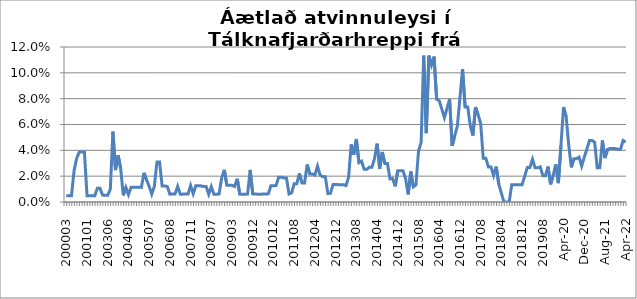
| Category | Series 0 |
|---|---|
| 200003 | 0.005 |
| 200004 | 0.005 |
| 200005 | 0.005 |
| 200008 | 0.024 |
| 200009 | 0.034 |
| 200010 | 0.039 |
| 200011 | 0.039 |
| 200012 | 0.039 |
| 200101 | 0.005 |
| 200112 | 0.005 |
| 200201 | 0.005 |
| 200202 | 0.005 |
| 200301 | 0.011 |
| 200302 | 0.011 |
| 200303 | 0.005 |
| 200304 | 0.005 |
| 200306 | 0.005 |
| 200307 | 0.01 |
| 200308 | 0.054 |
| 200309 | 0.025 |
| 200310 | 0.036 |
| 200311 | 0.026 |
| 200312 | 0.005 |
| 200407 | 0.011 |
| 200408 | 0.006 |
| 200409 | 0.011 |
| 200501 | 0.011 |
| 200502 | 0.011 |
| 200503 | 0.011 |
| 200504 | 0.011 |
| 200505 | 0.023 |
| 200506 | 0.017 |
| 200507 | 0.012 |
| 200508 | 0.006 |
| 200509 | 0.012 |
| 200510 | 0.031 |
| 200511 | 0.031 |
| 200512 | 0.012 |
| 200601 | 0.012 |
| 200607 | 0.012 |
| 200608 | 0.006 |
| 200701 | 0.006 |
| 200702 | 0.006 |
| 200705 | 0.012 |
| 200706 | 0.006 |
| 200707 | 0.006 |
| 200708 | 0.006 |
| 200709 | 0.006 |
| 200711 | 0.013 |
| 200712 | 0.006 |
| 200801 | 0.012 |
| 200802 | 0.012 |
| 200803 | 0.012 |
| 200804 | 0.012 |
| 200805 | 0.012 |
| 200806 | 0.006 |
| 200807 | 0.012 |
| 200808 | 0.006 |
| 200809 | 0.006 |
| 200810 | 0.006 |
| 200811 | 0.019 |
| 200812 | 0.025 |
| 200901 | 0.013 |
| 200902 | 0.013 |
| 200903 | 0.013 |
| 200904 | 0.012 |
| 200905 | 0.018 |
| 200906 | 0.006 |
| 200907 | 0.006 |
| 200909 | 0.006 |
| 200910 | 0.006 |
| 200911 | 0.025 |
| 200912 | 0.006 |
| 201001 | 0.006 |
| 201005 | 0.006 |
| 201006 | 0.006 |
| 201007 | 0.006 |
| 201009 | 0.006 |
| 201010 | 0.006 |
| 201011 | 0.013 |
| 201012 | 0.013 |
| 201101 | 0.013 |
| 201102 | 0.019 |
| 201103 | 0.019 |
| 201104 | 0.019 |
| 201105 | 0.019 |
| 201106 | 0.006 |
| 201107 | 0.007 |
| 201108 | 0.014 |
| 201109 | 0.014 |
| 201110 | 0.022 |
| 201111 | 0.015 |
| 201112 | 0.015 |
| 201201 | 0.029 |
| 201202 | 0.022 |
| 201203 | 0.022 |
| 201204 | 0.021 |
| 201205 | 0.028 |
| 201206 | 0.021 |
| 201207 | 0.02 |
| 201208 | 0.02 |
| 201209 | 0.007 |
| 201210 | 0.007 |
| 201211 | 0.014 |
| 201212 | 0.014 |
| 201301 | 0.013 |
| 201302 | 0.013 |
| 201303 | 0.013 |
| 201304 | 0.013 |
| 201305 | 0.019 |
| 201306 | 0.045 |
| 201307 | 0.037 |
| 201308 | 0.049 |
| 201309 | 0.03 |
| 201310 | 0.032 |
| 201311* | 0.025 |
| 201312 | 0.025 |
| 201401 | 0.027 |
| 201402 | 0.027 |
| 201403 | 0.034 |
| 201404 | 0.045 |
| 201405 | 0.026 |
| 201406 | 0.039 |
| 201407 | 0.03 |
| 201408 | 0.03 |
| 201409 | 0.018 |
| 201410 | 0.018 |
| 201411 | 0.012 |
| 201412 | 0.024 |
| 201501 | 0.024 |
| 201502 | 0.024 |
| 201503 | 0.018 |
| 201504 | 0.006 |
| 201505 | 0.024 |
| 201506 | 0.012 |
| 201507 | 0.013 |
| 201508 | 0.039 |
| 201509 | 0.046 |
| 201510 | 0.113 |
| 201511 | 0.053 |
| 201512 | 0.113 |
| 201601 | 0.106 |
| 201602 | 0.113 |
| 201603 | 0.079 |
| 201604 | 0.078 |
| 201605 | 0.072 |
| 201606 | 0.065 |
| 201607 | 0.072 |
| 201608 | 0.08 |
| 201609 | 0.043 |
| 201610 | 0.051 |
| 201611 | 0.059 |
| 201612 | 0.081 |
| 201701 | 0.103 |
| 201702 | 0.074 |
| 201703 | 0.074 |
| 201704 | 0.059 |
| 201705 | 0.051 |
| 201706 | 0.074 |
| 201707 | 0.068 |
| 201708 | 0.061 |
| 201709 | 0.034 |
| 201710 | 0.034 |
| 201711 | 0.027 |
| 201712 | 0.027 |
| 201801 | 0.021 |
| 201802 | 0.027 |
| 201803 | 0.014 |
| 201804 | 0.007 |
| 201805 | 0 |
| 201806 | 0 |
| 201807 | 0 |
| 201808 | 0.013 |
| 201809 | 0.013 |
| 201810 | 0.013 |
| 201811 | 0.013 |
| 201812 | 0.013 |
| 201901 | 0.02 |
| 201902 | 0.027 |
| 201903 | 0.027 |
| 201904 | 0.033 |
| 201905 | 0.026 |
| 201906 | 0.026 |
| 201907 | 0.027 |
| 201908 | 0.02 |
| 201909 | 0.02 |
| 201910 | 0.027 |
| 201911 | 0.014 |
| 201912 | 0.021 |
| 202001 | 0.029 |
| feb.20 | 0.015 |
| mar.20 | 0.044 |
| apr.20 | 0.074 |
| maí.20 | 0.066 |
| jún.20 | 0.044 |
| júl.20 | 0.027 |
| ágú.20 | 0.034 |
| sep.20 | 0.034 |
| okt.20 | 0.035 |
| nóv.20 | 0.028 |
| des.20 | 0.035 |
| jan.21 | 0.041 |
| feb.21 | 0.048 |
| mar.21 | 0.048 |
| apr.21 | 0.046 |
| maí.21 | 0.026 |
| jún.21 | 0.026 |
| júl.21 | 0.048 |
| ágú.21 | 0.034 |
| sep.21 | 0.041 |
| okt.21 | 0.041 |
| nóv.21 | 0.041 |
| des.21 | 0.041 |
| jan.22 | 0.041 |
| feb.22 | 0.041 |
| mar.22 | 0.048 |
| apr.22 | 0.046 |